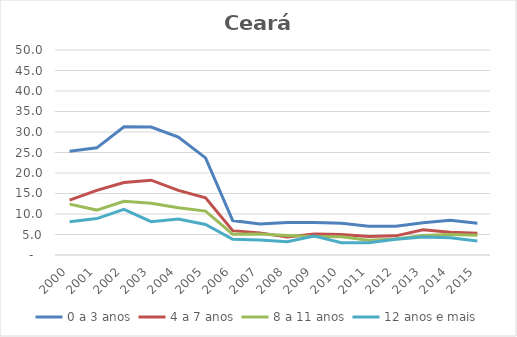
| Category | 0 a 3 anos | 4 a 7 anos | 8 a 11 anos | 12 anos e mais |
|---|---|---|---|---|
| 2000.0 | 25.307 | 13.388 | 12.415 | 8.095 |
| 2001.0 | 26.133 | 15.753 | 10.955 | 8.879 |
| 2002.0 | 31.255 | 17.676 | 13.079 | 11.149 |
| 2003.0 | 31.204 | 18.252 | 12.642 | 8.116 |
| 2004.0 | 28.787 | 15.771 | 11.511 | 8.767 |
| 2005.0 | 23.697 | 13.966 | 10.717 | 7.43 |
| 2006.0 | 8.389 | 5.936 | 5.059 | 3.829 |
| 2007.0 | 7.545 | 5.397 | 5.105 | 3.665 |
| 2008.0 | 7.934 | 4.411 | 4.775 | 3.243 |
| 2009.0 | 7.94 | 5.114 | 4.487 | 4.645 |
| 2010.0 | 7.714 | 5.028 | 4.457 | 3 |
| 2011.0 | 7.027 | 4.519 | 3.623 | 3.007 |
| 2012.0 | 7.029 | 4.665 | 3.917 | 3.859 |
| 2013.0 | 7.862 | 6.133 | 4.76 | 4.405 |
| 2014.0 | 8.451 | 5.57 | 4.994 | 4.222 |
| 2015.0 | 7.754 | 5.331 | 4.824 | 3.39 |